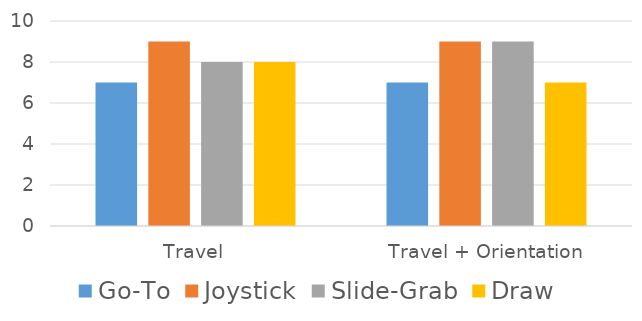
| Category | Go-To | Joystick | Slide-Grab | Draw |
|---|---|---|---|---|
| Travel | 7 | 9 | 8 | 8 |
| Travel + Orientation | 7 | 9 | 9 | 7 |